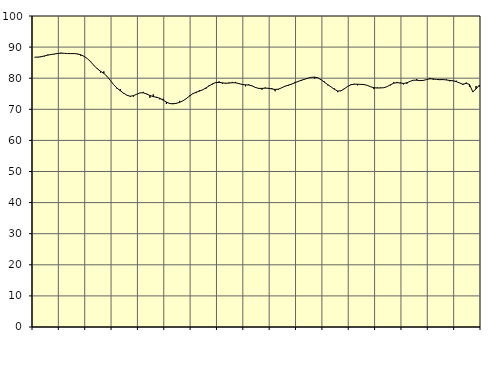
| Category | Piggar | Series 1 |
|---|---|---|
| nan | 86.7 | 86.77 |
| 87.0 | 86.7 | 86.78 |
| 87.0 | 87.1 | 86.91 |
| 87.0 | 87 | 87.17 |
| nan | 87.6 | 87.42 |
| 88.0 | 87.6 | 87.62 |
| 88.0 | 87.7 | 87.79 |
| 88.0 | 88.1 | 87.96 |
| nan | 88.2 | 88.06 |
| 89.0 | 88 | 88 |
| 89.0 | 87.9 | 87.92 |
| 89.0 | 87.9 | 87.91 |
| nan | 88 | 87.92 |
| 90.0 | 87.7 | 87.81 |
| 90.0 | 87.2 | 87.53 |
| 90.0 | 87.1 | 87.04 |
| nan | 86.3 | 86.29 |
| 91.0 | 85.4 | 85.28 |
| 91.0 | 84.2 | 84.11 |
| 91.0 | 83.2 | 83.04 |
| nan | 81.8 | 82.25 |
| 92.0 | 82.2 | 81.54 |
| 92.0 | 80.5 | 80.58 |
| 92.0 | 79.3 | 79.26 |
| nan | 77.9 | 77.9 |
| 93.0 | 76.6 | 76.83 |
| 93.0 | 76.5 | 75.97 |
| 93.0 | 75.1 | 75.21 |
| nan | 74.5 | 74.53 |
| 94.0 | 74 | 74.2 |
| 94.0 | 74.1 | 74.38 |
| 94.0 | 74.9 | 74.85 |
| nan | 75.3 | 75.29 |
| 95.0 | 75.6 | 75.3 |
| 95.0 | 75 | 74.89 |
| 95.0 | 73.7 | 74.44 |
| nan | 74.8 | 74.09 |
| 96.0 | 73.7 | 73.88 |
| 96.0 | 73.2 | 73.54 |
| 96.0 | 73.4 | 72.95 |
| nan | 71.7 | 72.32 |
| 97.0 | 72 | 71.85 |
| 97.0 | 72 | 71.75 |
| 97.0 | 71.8 | 71.94 |
| nan | 72.7 | 72.23 |
| 98.0 | 72.7 | 72.72 |
| 98.0 | 73.5 | 73.42 |
| 98.0 | 74.4 | 74.24 |
| nan | 75.1 | 75.01 |
| 99.0 | 75.2 | 75.5 |
| 99.0 | 76.1 | 75.84 |
| 99.0 | 76.2 | 76.26 |
| nan | 76.6 | 76.86 |
| 0.0 | 77.8 | 77.54 |
| 0.0 | 78 | 78.2 |
| 0.0 | 78.5 | 78.6 |
| nan | 79 | 78.66 |
| 1.0 | 78.2 | 78.5 |
| 1.0 | 78.5 | 78.36 |
| 1.0 | 78.6 | 78.44 |
| nan | 78.8 | 78.56 |
| 2.0 | 78.8 | 78.52 |
| 2.0 | 78.2 | 78.27 |
| 2.0 | 77.9 | 77.98 |
| nan | 77.4 | 77.86 |
| 3.0 | 78 | 77.81 |
| 3.0 | 77.6 | 77.53 |
| 3.0 | 76.9 | 77.03 |
| nan | 76.6 | 76.73 |
| 4.0 | 76.3 | 76.72 |
| 4.0 | 77 | 76.8 |
| 4.0 | 76.6 | 76.76 |
| nan | 76.8 | 76.56 |
| 5.0 | 75.8 | 76.38 |
| 5.0 | 76.3 | 76.48 |
| 5.0 | 76.9 | 76.92 |
| nan | 77.5 | 77.42 |
| 6.0 | 77.5 | 77.76 |
| 6.0 | 78 | 78.1 |
| 6.0 | 78.8 | 78.52 |
| nan | 78.8 | 78.96 |
| 7.0 | 79.1 | 79.35 |
| 7.0 | 79.6 | 79.68 |
| 7.0 | 80 | 80.02 |
| nan | 80.3 | 80.28 |
| 8.0 | 79.9 | 80.35 |
| 8.0 | 80.1 | 80.11 |
| 8.0 | 79.4 | 79.48 |
| nan | 78.9 | 78.7 |
| 9.0 | 77.7 | 77.92 |
| 9.0 | 77.2 | 77.18 |
| 9.0 | 76.7 | 76.42 |
| nan | 75.5 | 75.88 |
| 10.0 | 75.9 | 75.94 |
| 10.0 | 76.7 | 76.58 |
| 10.0 | 77.4 | 77.35 |
| nan | 78 | 77.88 |
| 11.0 | 78.2 | 78.07 |
| 11.0 | 77.7 | 78.06 |
| 11.0 | 78.1 | 78.01 |
| nan | 78 | 77.96 |
| 12.0 | 77.6 | 77.68 |
| 12.0 | 77.2 | 77.24 |
| 12.0 | 76.5 | 76.94 |
| nan | 77 | 76.84 |
| 13.0 | 77 | 76.87 |
| 13.0 | 76.9 | 76.94 |
| 13.0 | 77.3 | 77.29 |
| nan | 77.7 | 77.89 |
| 14.0 | 78.7 | 78.39 |
| 14.0 | 78.8 | 78.58 |
| 14.0 | 78.6 | 78.43 |
| nan | 78 | 78.32 |
| 15.0 | 78.2 | 78.53 |
| 15.0 | 79 | 79 |
| 15.0 | 79.3 | 79.36 |
| nan | 79.7 | 79.35 |
| 16.0 | 79.2 | 79.22 |
| 16.0 | 79.2 | 79.29 |
| 16.0 | 79.6 | 79.57 |
| nan | 80.1 | 79.81 |
| 17.0 | 79.5 | 79.77 |
| 17.0 | 79.6 | 79.59 |
| 17.0 | 79.4 | 79.54 |
| nan | 79.5 | 79.56 |
| 18.0 | 79.6 | 79.43 |
| 18.0 | 79 | 79.28 |
| 18.0 | 79.1 | 79.18 |
| nan | 79.2 | 78.9 |
| 19.0 | 78.5 | 78.47 |
| 19.0 | 77.8 | 78.06 |
| 19.0 | 78.6 | 78.34 |
| nan | 77.3 | 78 |
| 20.0 | 75.9 | 75.63 |
| 20.0 | 77.5 | 76.56 |
| 20.0 | 77.3 | 77.78 |